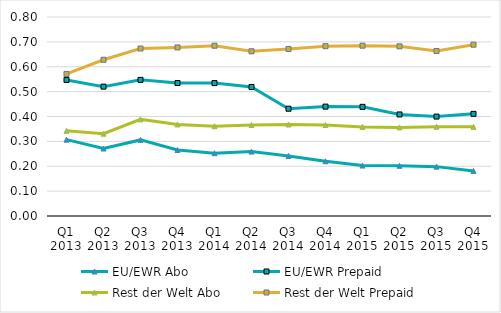
| Category | EU/EWR | Rest der Welt |
|---|---|---|
| Q1 2013 | 0.547 | 0.571 |
| Q2 2013 | 0.52 | 0.628 |
| Q3 2013 | 0.547 | 0.673 |
| Q4 2013 | 0.535 | 0.678 |
| Q1 2014 | 0.534 | 0.685 |
| Q2 2014 | 0.519 | 0.662 |
| Q3 2014 | 0.431 | 0.672 |
| Q4 2014 | 0.44 | 0.683 |
| Q1 2015 | 0.439 | 0.685 |
| Q2 2015 | 0.408 | 0.682 |
| Q3 2015 | 0.4 | 0.663 |
| Q4 2015 | 0.411 | 0.689 |